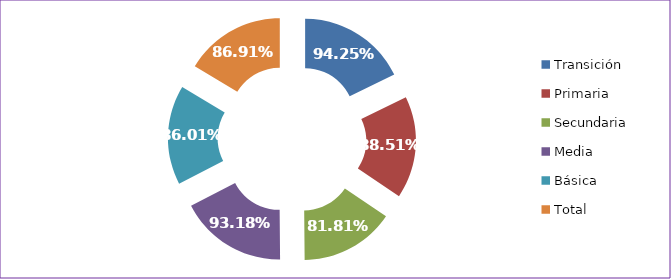
| Category | Tasa Aprobación |
|---|---|
| Transición | 0.942 |
| Primaria | 0.885 |
| Secundaria | 0.818 |
| Media | 0.932 |
| Básica | 0.86 |
| Total | 0.869 |